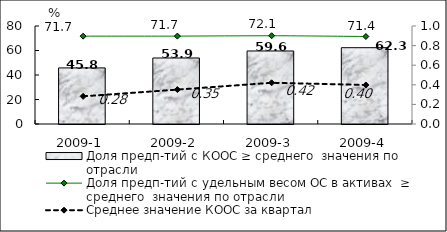
| Category | Доля предп-тий с КООС ≥ среднего  значения по отрасли |
|---|---|
| 2009-1 | 45.78 |
| 2009-2 | 53.89 |
| 2009-3 | 59.61 |
| 2009-4 | 62.29 |